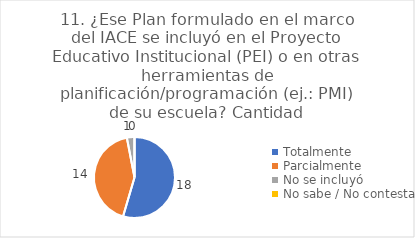
| Category | 11. ¿Ese Plan formulado en el marco del IACE se incluyó en el Proyecto Educativo Institucional (PEI) o en otras herramientas de planificación/programación (ej.: PMI) de su escuela? |
|---|---|
| Totalmente  | 0.545 |
| Parcialmente  | 0.424 |
| No se incluyó  | 0.03 |
| No sabe / No contesta | 0 |